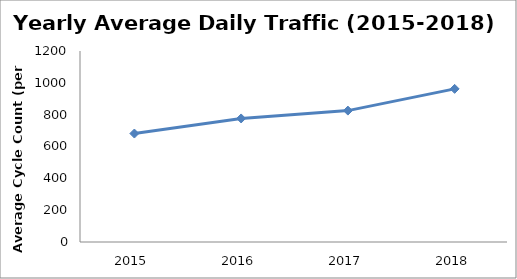
| Category | Series 0 |
|---|---|
| 2015.0 | 681.411 |
| 2016.0 | 776.257 |
| 2017.0 | 825.521 |
| 2018.0 | 962.104 |